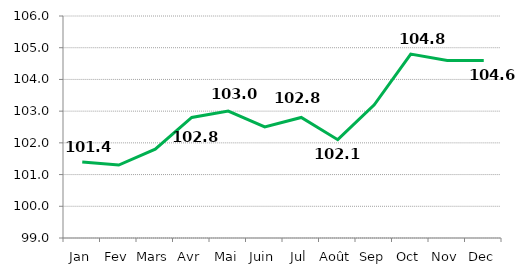
| Category |   INDICE  GENERAL     |
|---|---|
| Jan | 101.4 |
| Fev | 101.3 |
| Mars | 101.8 |
| Avr | 102.8 |
| Mai | 103 |
| Juin | 102.5 |
| Jul | 102.8 |
| Août | 102.1 |
| Sep | 103.2 |
| Oct | 104.8 |
| Nov | 104.6 |
| Dec | 104.6 |